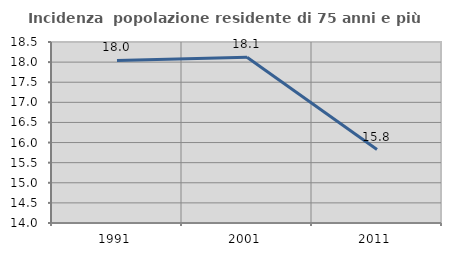
| Category | Incidenza  popolazione residente di 75 anni e più |
|---|---|
| 1991.0 | 18.04 |
| 2001.0 | 18.122 |
| 2011.0 | 15.826 |